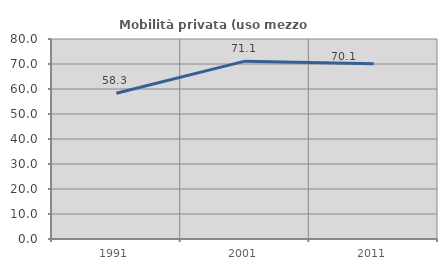
| Category | Mobilità privata (uso mezzo privato) |
|---|---|
| 1991.0 | 58.326 |
| 2001.0 | 71.137 |
| 2011.0 | 70.059 |